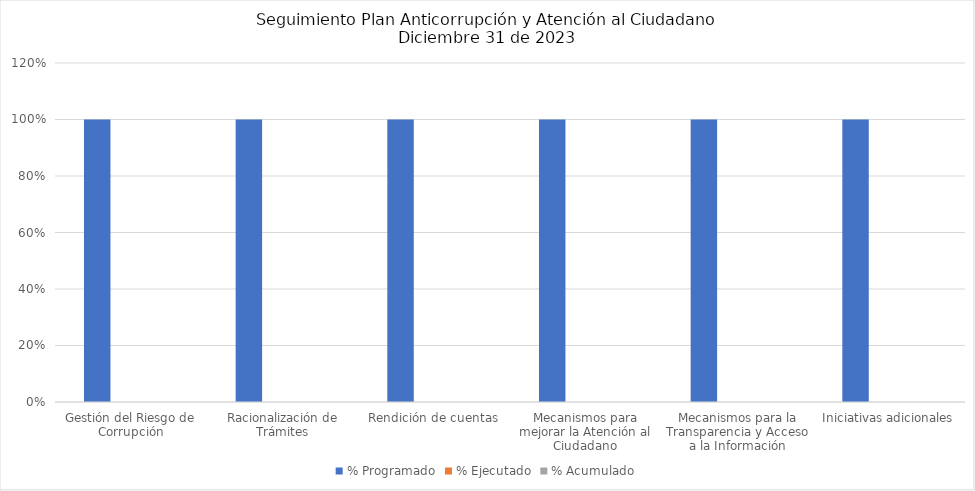
| Category | % Programado | % Ejecutado | % Acumulado |
|---|---|---|---|
| Gestión del Riesgo de Corrupción | 1 | 0 | 0 |
| Racionalización de Trámites | 1 | 0 | 0 |
| Rendición de cuentas | 1 | 0 | 0 |
| Mecanismos para mejorar la Atención al Ciudadano | 1 | 0 | 0 |
| Mecanismos para la Transparencia y Acceso a la Información | 1 | 0 | 0 |
| Iniciativas adicionales | 1 | 0 | 0 |